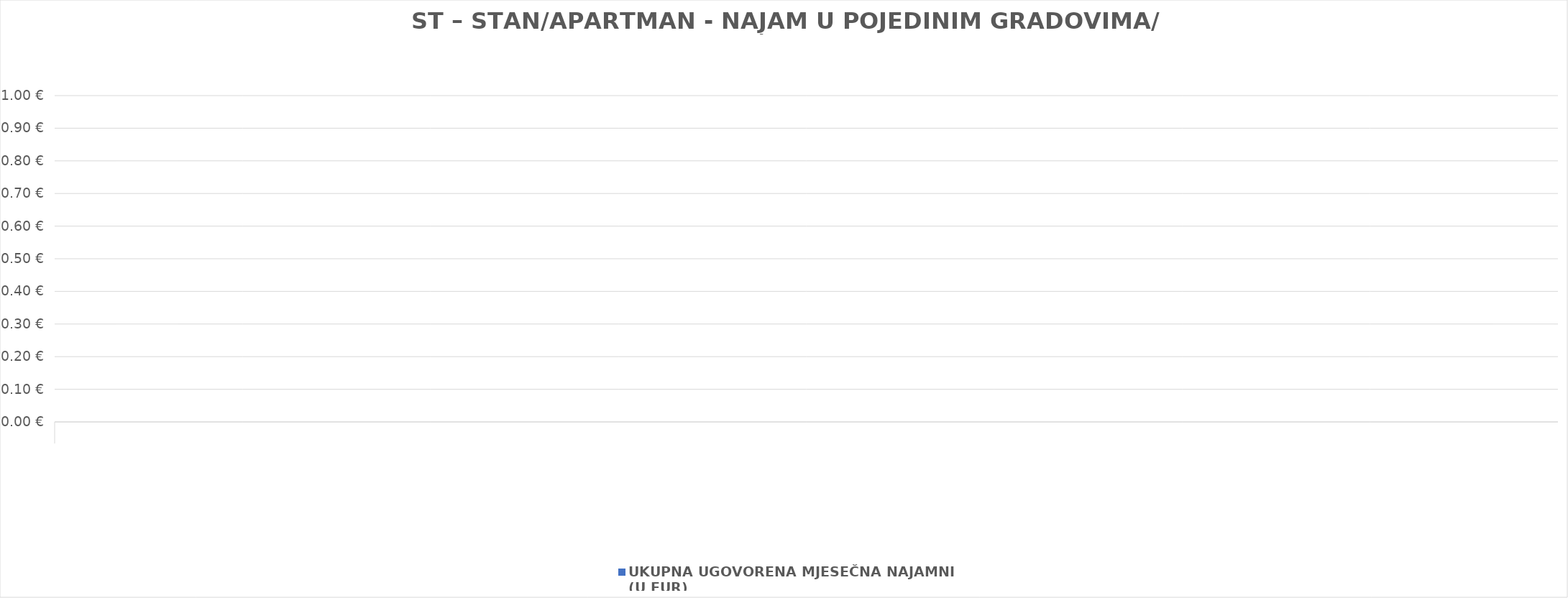
| Category | UKUPNA UGOVORENA MJESEČNA NAJAMNINA 
(U EUR) |
|---|---|
| 0 | 0 |